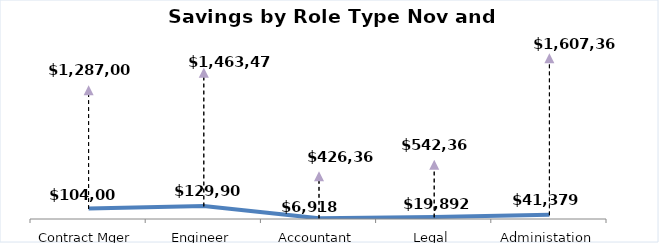
| Category | Monthly Savings | Annual Savings |
|---|---|---|
| Contract Mger | 104000 | 1287000 |
| Engineer | 129900.333 | 1463475 |
| Accountant | 6918.167 | 426367.5 |
| Legal | 19892.167 | 542368.667 |
| Administation | 41379 | 1607367.667 |